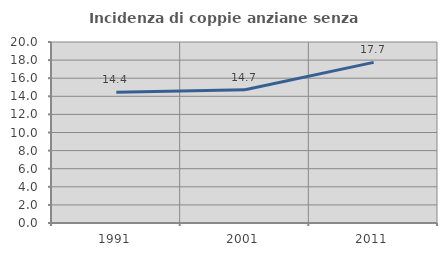
| Category | Incidenza di coppie anziane senza figli  |
|---|---|
| 1991.0 | 14.447 |
| 2001.0 | 14.732 |
| 2011.0 | 17.749 |